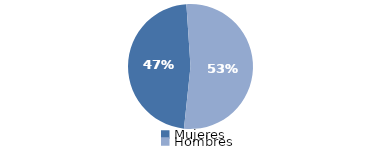
| Category | Series 0 |
|---|---|
| Mujeres | 1926.881 |
| Hombres | 2148.13 |